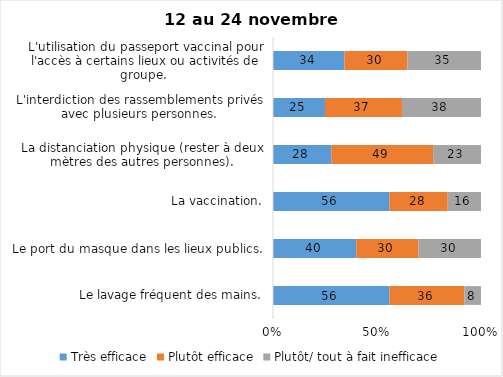
| Category | Très efficace | Plutôt efficace | Plutôt/ tout à fait inefficace |
|---|---|---|---|
| Le lavage fréquent des mains. | 56 | 36 | 8 |
| Le port du masque dans les lieux publics. | 40 | 30 | 30 |
| La vaccination. | 56 | 28 | 16 |
| La distanciation physique (rester à deux mètres des autres personnes). | 28 | 49 | 23 |
| L'interdiction des rassemblements privés avec plusieurs personnes. | 25 | 37 | 38 |
| L'utilisation du passeport vaccinal pour l'accès à certains lieux ou activités de groupe.  | 34 | 30 | 35 |